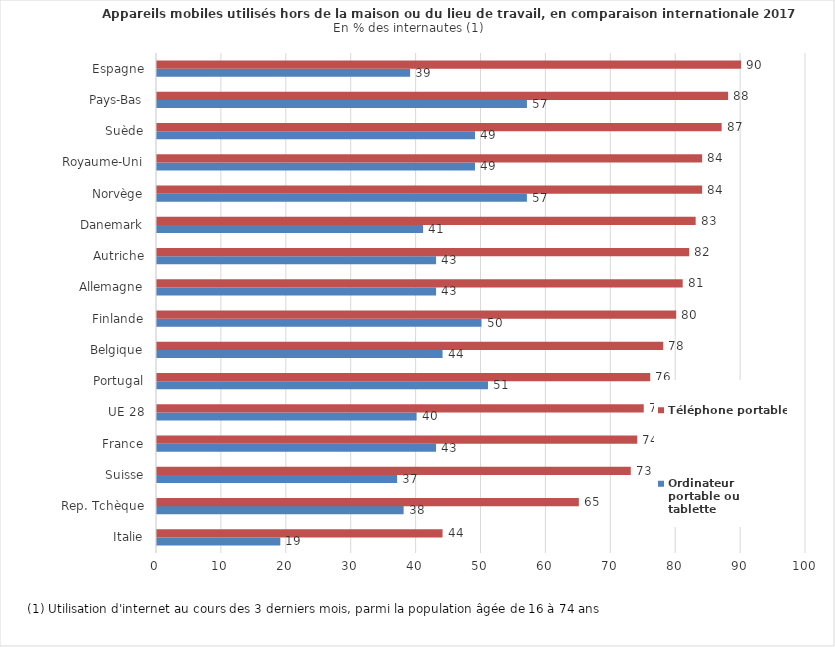
| Category | Ordinateur portable ou tablette | Téléphone portable |
|---|---|---|
| Italie | 19 | 44 |
| Rep. Tchèque | 38 | 65 |
| Suisse | 37 | 73 |
| France | 43 | 74 |
| UE 28 | 40 | 75 |
| Portugal | 51 | 76 |
| Belgique | 44 | 78 |
| Finlande | 50 | 80 |
| Allemagne | 43 | 81 |
| Autriche | 43 | 82 |
| Danemark | 41 | 83 |
| Norvège | 57 | 84 |
| Royaume-Uni | 49 | 84 |
| Suède | 49 | 87 |
| Pays-Bas | 57 | 88 |
| Espagne | 39 | 90 |